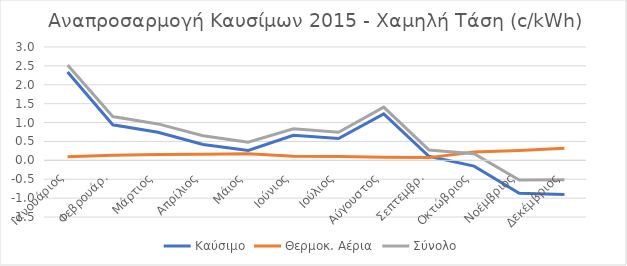
| Category | Καύσιμο | Θερμοκ. Αέρια | Σύνολο |
|---|---|---|---|
| Ιανουάριος | 2.34 | 0.098 | 2.522 |
| Φεβρουάρ. | 0.94 | 0.137 | 1.158 |
| Μάρτιος | 0.741 | 0.156 | 0.964 |
| Απρίλιος | 0.419 | 0.16 | 0.651 |
| Μάιος | 0.262 | 0.174 | 0.481 |
| Ιούνιος | 0.665 | 0.11 | 0.835 |
| Ιούλιος | 0.576 | 0.101 | 0.745 |
| Αύγουστος | 1.23 | 0.08 | 1.41 |
| Σεπτεμβρ. | 0.107 | 0.072 | 0.275 |
| Οκτώβριος | -0.154 | 0.218 | 0.175 |
| Νοέμβριος | -0.873 | 0.263 | -0.523 |
| Δεκέμβριος | -0.907 | 0.318 | -0.514 |